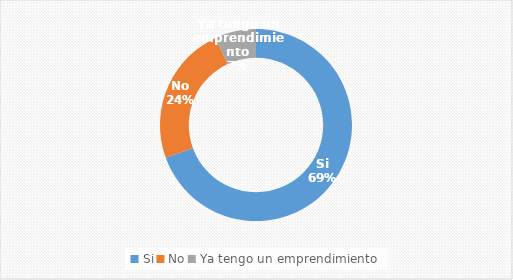
| Category | Series 0 |
|---|---|
| Si | 0.694 |
| No | 0.236 |
| Ya tengo un emprendimiento | 0.069 |